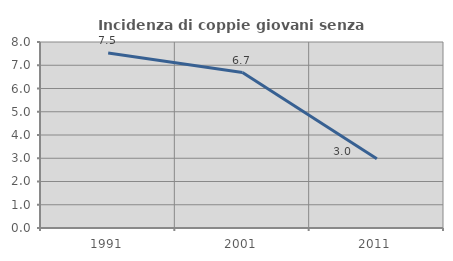
| Category | Incidenza di coppie giovani senza figli |
|---|---|
| 1991.0 | 7.525 |
| 2001.0 | 6.687 |
| 2011.0 | 2.976 |